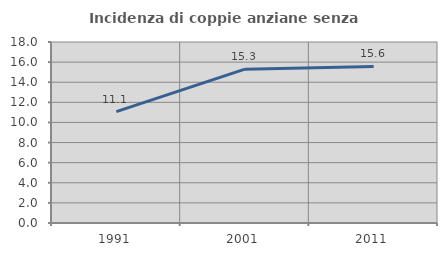
| Category | Incidenza di coppie anziane senza figli  |
|---|---|
| 1991.0 | 11.081 |
| 2001.0 | 15.297 |
| 2011.0 | 15.575 |